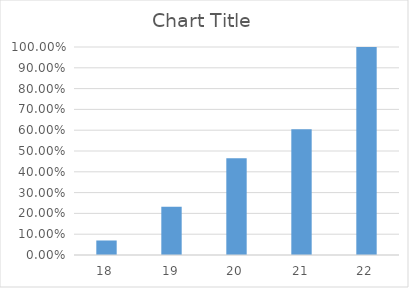
| Category | Series 0 |
|---|---|
| 18.0 | 0.07 |
| 19.0 | 0.233 |
| 20.0 | 0.465 |
| 21.0 | 0.605 |
| 22.0 | 1 |